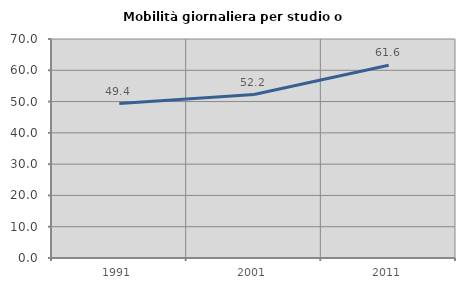
| Category | Mobilità giornaliera per studio o lavoro |
|---|---|
| 1991.0 | 49.369 |
| 2001.0 | 52.239 |
| 2011.0 | 61.612 |